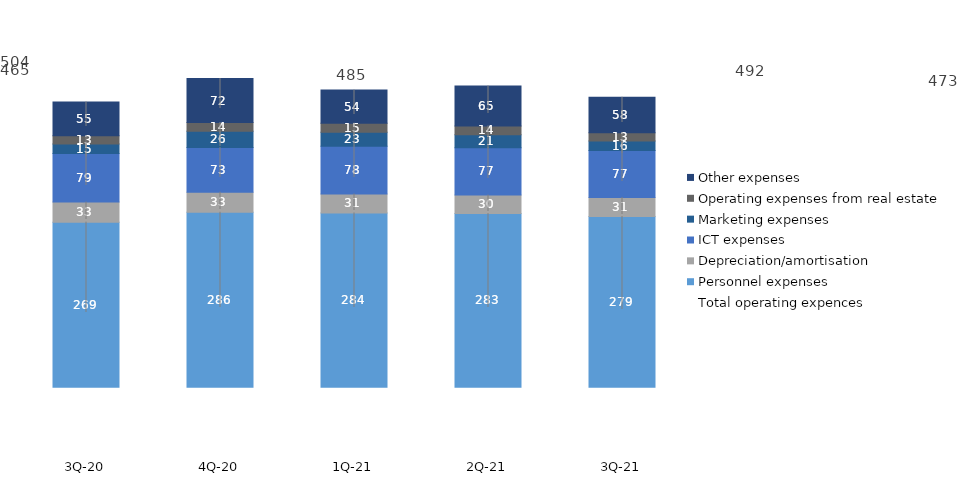
| Category | Personnel expenses | Depreciation/amortisation | ICT expenses | Marketing expenses | Operating expenses from real estate | Other expenses |
|---|---|---|---|---|---|---|
| 3Q-21 | 278.559 | 31.02 | 76.673 | 15.647 | 13.199 | 58.08 |
| 2Q-21 | 283.281 | 30.262 | 77.334 | 20.954 | 14.498 | 65.226 |
| 1Q-21 | 284.424 | 30.808 | 77.869 | 22.842 | 14.891 | 54.02 |
| 4Q-20 | 285.521 | 32.718 | 72.758 | 26.486 | 14.438 | 71.608 |
| 3Q-20 | 269.351 | 32.697 | 79.5 | 15.261 | 13.478 | 55.019 |